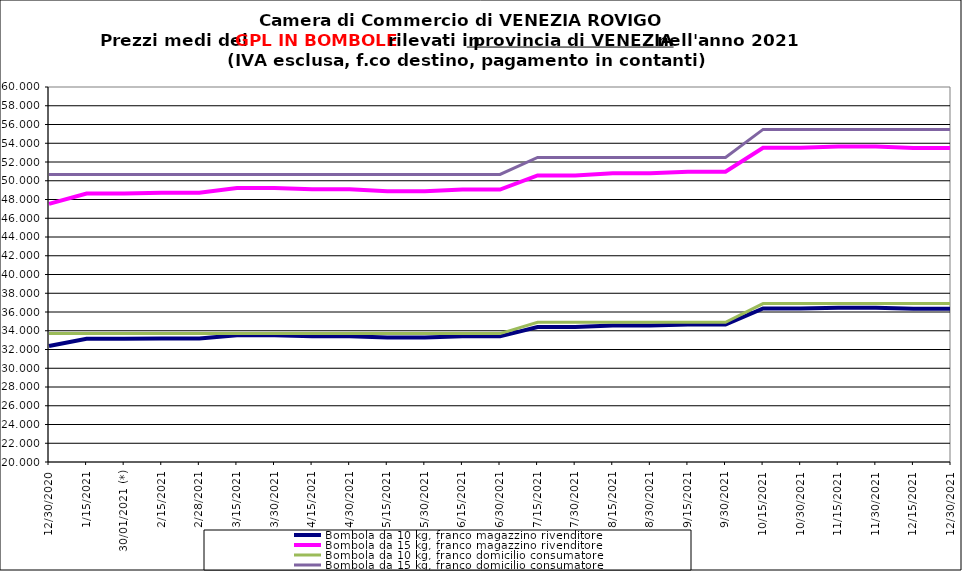
| Category | Bombola da 10 kg, franco magazzino rivenditore | Bombola da 15 kg, franco magazzino rivenditore | Bombola da 10 kg, franco domicilio consumatore | Bombola da 15 kg, franco domicilio consumatore |
|---|---|---|---|---|
| 30/12/2020 | 32.382 | 47.528 | 33.7 | 50.68 |
| 15/01/2021 | 33.145 | 48.633 | 33.7 | 50.68 |
| 30/01/2021 (*) | 33.145 | 48.633 | 33.7 | 50.68 |
| 15/02/2021 | 33.182 | 48.728 | 33.7 | 50.68 |
| 28/02/2021 | 33.182 | 48.728 | 33.7 | 50.68 |
| 15/03/2021 | 33.52 | 49.236 | 33.7 | 50.68 |
| 30/03/2021 | 33.52 | 49.236 | 33.7 | 50.68 |
| 15/04/2021 | 33.42 | 49.083 | 33.7 | 50.68 |
| 30/04/2021 | 33.42 | 49.083 | 33.7 | 50.68 |
| 15/05/2021 | 33.292 | 48.893 | 33.7 | 50.68 |
| 30/05/2021 | 33.292 | 48.893 | 33.7 | 50.68 |
| 15/06/2021 | 33.405 | 49.063 | 33.7 | 50.68 |
| 30/06/2021 | 33.405 | 49.063 | 33.7 | 50.68 |
| 15/07/2021 | 34.405 | 50.565 | 34.9 | 52.48 |
| 30/07/2021 | 34.405 | 50.565 | 34.9 | 52.48 |
| 15/08/2021 | 34.557 | 50.793 | 34.9 | 52.48 |
| 30/08/2021 | 34.557 | 50.793 | 34.9 | 52.48 |
| 15/09/2021 | 34.67 | 50.962 | 34.9 | 52.48 |
| 30/09/2021 | 34.67 | 50.962 | 34.9 | 52.48 |
| 15/10/2021 | 36.37 | 53.512 | 36.9 | 55.48 |
| 30/10/2021 | 36.37 | 53.512 | 36.9 | 55.48 |
| 15/11/2021 | 36.462 | 53.652 | 36.9 | 55.48 |
| 30/11/2021 | 36.462 | 53.652 | 36.9 | 55.48 |
| 15/12/2021 | 36.35 | 53.485 | 36.9 | 55.48 |
| 30/12/2021 | 36.35 | 53.484 | 36.9 | 55.48 |